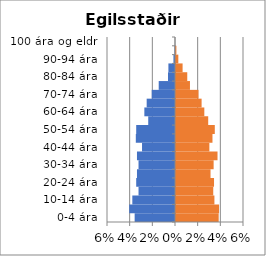
| Category | % karlar | %konur |
|---|---|---|
| 0-4 ára | -0.036 | 0.038 |
| 5-9 ára | -0.04 | 0.038 |
| 10-14 ára | -0.038 | 0.034 |
| 15-19 ára | -0.032 | 0.033 |
| 20-24 ára | -0.034 | 0.034 |
| 25-29 ára | -0.034 | 0.03 |
| 30-34 ára | -0.032 | 0.033 |
| 35-39 ára | -0.034 | 0.037 |
| 40-44 ára | -0.029 | 0.029 |
| 45-49 ára | -0.035 | 0.032 |
| 50-54 ára | -0.034 | 0.034 |
| 55-59 ára | -0.024 | 0.028 |
| 60-64 ára | -0.027 | 0.025 |
| 65-69 ára | -0.025 | 0.023 |
| 70-74 ára | -0.021 | 0.02 |
| 75-79 ára | -0.014 | 0.012 |
| 80-84 ára | -0.006 | 0.01 |
| 85-89 ára | -0.006 | 0.006 |
| 90-94 ára | -0.001 | 0.002 |
| 95-99 ára | 0 | 0 |
| 100 ára og eldri | 0 | 0 |